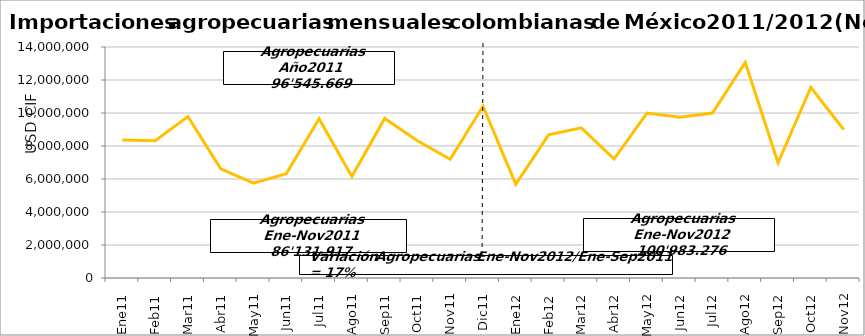
| Category | Agropecuarias |
|---|---|
| 0 | 8360996.07 |
| 1 | 8317929.13 |
| 2 | 9778659.54 |
| 3 | 6612682.86 |
| 4 | 5749897.33 |
| 5 | 6324540.93 |
| 6 | 9653299.27 |
| 7 | 6147722.2 |
| 8 | 9670352.09 |
| 9 | 8315908.47 |
| 10 | 7199928.82 |
| 11 | 10413752.74 |
| 12 | 5671512.71 |
| 13 | 8672938.09 |
| 14 | 9103673.27 |
| 15 | 7209596.64 |
| 16 | 9995918.97 |
| 17 | 9739197.75 |
| 18 | 9995269.16 |
| 19 | 13058864.2 |
| 20 | 6982157.32 |
| 21 | 11551422.75 |
| 22 | 9002724.88 |